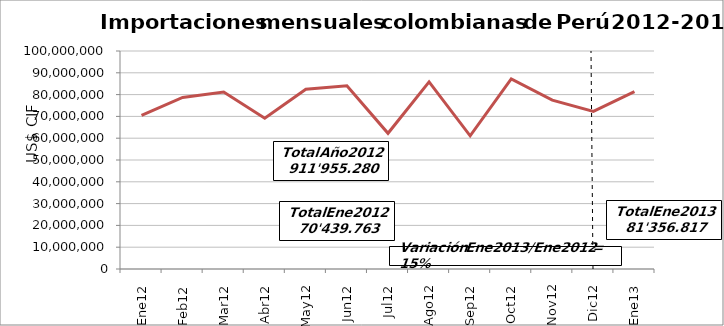
| Category | Series 0 |
|---|---|
| 0 | 70439763.44 |
| 1 | 78687730.14 |
| 2 | 81143593.22 |
| 3 | 69154596.53 |
| 4 | 82437041.95 |
| 5 | 84040996.35 |
| 6 | 62244445.53 |
| 7 | 85861091.01 |
| 8 | 61080567.3 |
| 9 | 87158518.21 |
| 10 | 77439641.32 |
| 11 | 72267294.75 |
| 12 | 81356817.28 |